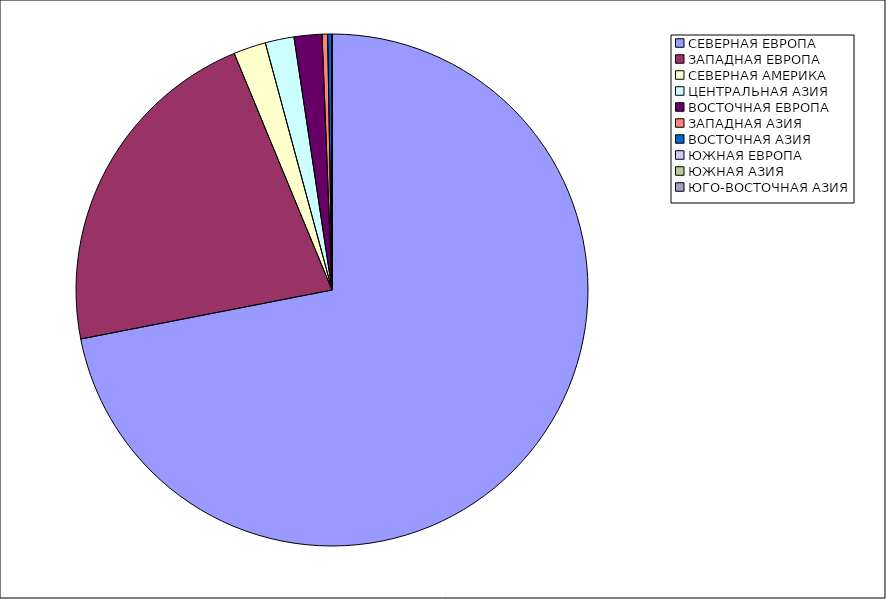
| Category | Оборот |
|---|---|
| СЕВЕРНАЯ ЕВРОПА | 71.933 |
| ЗАПАДНАЯ ЕВРОПА | 21.829 |
| СЕВЕРНАЯ АМЕРИКА | 2.043 |
| ЦЕНТРАЛЬНАЯ АЗИЯ | 1.818 |
| ВОСТОЧНАЯ ЕВРОПА | 1.757 |
| ЗАПАДНАЯ АЗИЯ | 0.348 |
| ВОСТОЧНАЯ АЗИЯ | 0.266 |
| ЮЖНАЯ ЕВРОПА | 0.005 |
| ЮЖНАЯ АЗИЯ | 0 |
| ЮГО-ВОСТОЧНАЯ АЗИЯ | 0 |